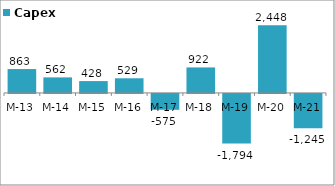
| Category | Capex |
|---|---|
| 2013-03-31 | 863.36 |
| 2014-03-31 | 561.54 |
| 2015-03-31 | 427.67 |
| 2016-03-31 | 529.18 |
| 2017-03-31 | -575.18 |
| 2018-03-31 | 921.99 |
| 2019-03-31 | -1794.48 |
| 2020-03-31 | 2447.86 |
| 2021-03-31 | -1244.55 |